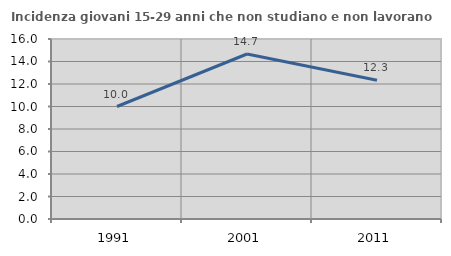
| Category | Incidenza giovani 15-29 anni che non studiano e non lavorano  |
|---|---|
| 1991.0 | 10 |
| 2001.0 | 14.667 |
| 2011.0 | 12.329 |